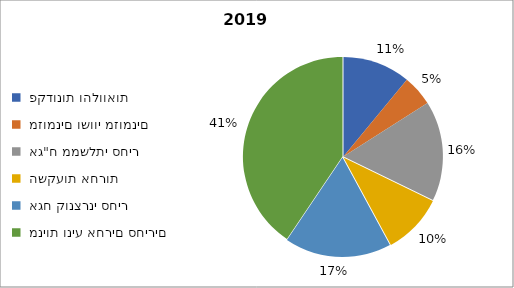
| Category | קרן השתלמות אומגה מסלול כללי [286] - דצמבר 2019 |
|---|---|
|  פקדונות והלוואות  | 275034 |
|  מזומנים ושווי מזומנים   | 125108 |
|  אג"ח ממשלתי סחיר  | 406226 |
|  השקעות אחרות  | 247278 |
|  אגח קונצרני סחיר  | 433732 |
|  מניות וניע אחרים סחירים   | 1015435 |